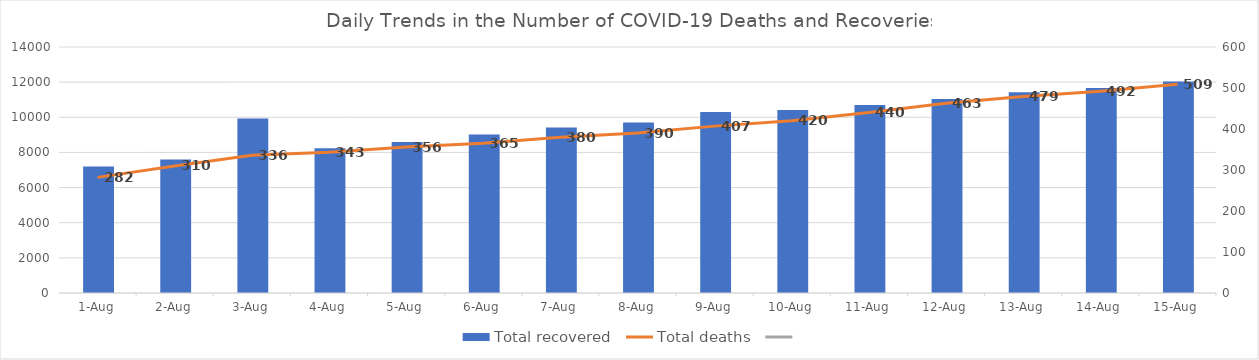
| Category | Total recovered  |
|---|---|
| 2020-08-01 | 7195 |
| 2020-08-02 | 7601 |
| 2020-08-03 | 9931 |
| 2020-08-04 | 8240 |
| 2020-08-05 | 8598 |
| 2020-08-06 | 9027 |
| 2020-08-07 | 9415 |
| 2020-08-08 | 9707 |
| 2020-08-09 | 10296 |
| 2020-08-10 | 10411 |
| 2020-08-11 | 10696 |
| 2020-08-12 | 11034 |
| 2020-08-13 | 11428 |
| 2020-08-14 | 11660 |
| 2020-08-15 | 12037 |